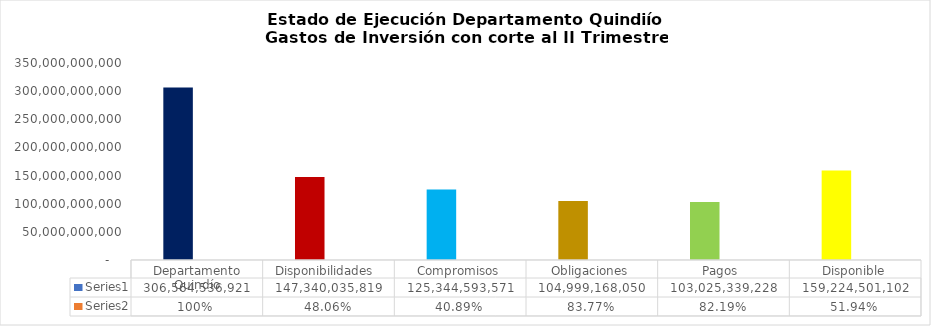
| Category | Series 0 | Series 1 |
|---|---|---|
| Departamento Quindío | 306564536920.93 | 1 |
| Disponibilidades  | 147340035819.15 | 0.481 |
| Compromisos | 125344593571.17 | 0.409 |
| Obligaciones | 104999168050.41 | 0.838 |
| Pagos  | 103025339227.63 | 0.822 |
| Disponible | 159224501101.78 | 0.519 |